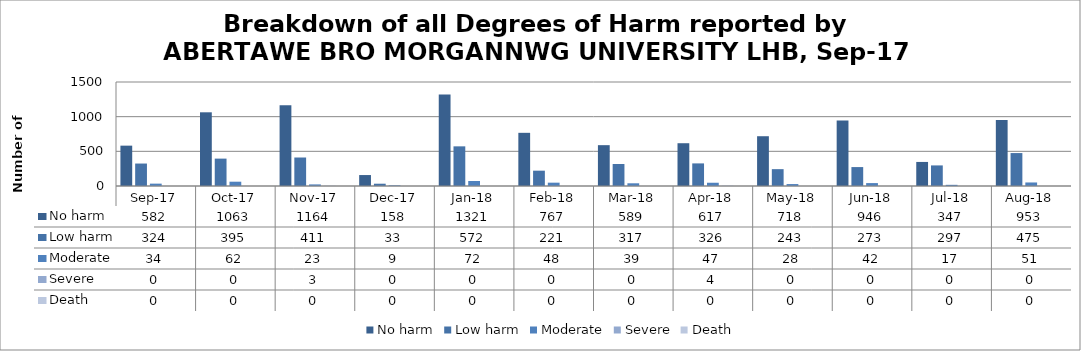
| Category | No harm | Low harm | Moderate | Severe | Death |
|---|---|---|---|---|---|
| Sep-17 | 582 | 324 | 34 | 0 | 0 |
| Oct-17 | 1063 | 395 | 62 | 0 | 0 |
| Nov-17 | 1164 | 411 | 23 | 3 | 0 |
| Dec-17 | 158 | 33 | 9 | 0 | 0 |
| Jan-18 | 1321 | 572 | 72 | 0 | 0 |
| Feb-18 | 767 | 221 | 48 | 0 | 0 |
| Mar-18 | 589 | 317 | 39 | 0 | 0 |
| Apr-18 | 617 | 326 | 47 | 4 | 0 |
| May-18 | 718 | 243 | 28 | 0 | 0 |
| Jun-18 | 946 | 273 | 42 | 0 | 0 |
| Jul-18 | 347 | 297 | 17 | 0 | 0 |
| Aug-18 | 953 | 475 | 51 | 0 | 0 |